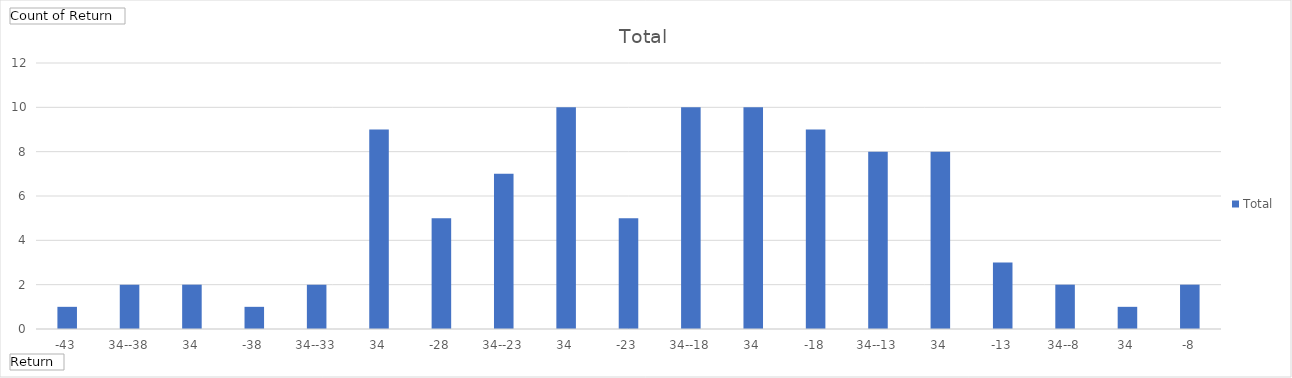
| Category | Total |
|---|---|
| -43,34--38,34 | 1 |
| -38,34--33,34 | 2 |
| -28,34--23,34 | 2 |
| -23,34--18,34 | 1 |
| -18,34--13,34 | 2 |
| -13,34--8,34 | 9 |
| -8,34--3,34 | 5 |
| -3,34-1,66 | 7 |
| 1,66-6,66 | 10 |
| 6,66-11,66 | 5 |
| 11,66-16,66 | 10 |
| 16,66-21,66 | 10 |
| 21,66-26,66 | 9 |
| 26,66-31,66 | 8 |
| 31,66-36,66 | 8 |
| 36,66-41,66 | 3 |
| 41,66-46,66 | 2 |
| 46,66-51,66 | 1 |
| 51,66-56,66 | 2 |